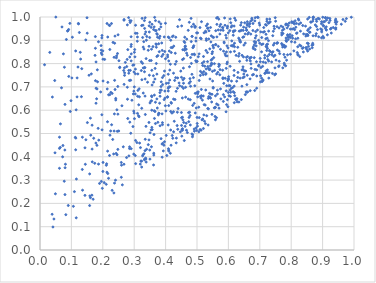
| Category | Series 0 |
|---|---|
| 0.498288084504814 | 0.808 |
| 0.7712849469028652 | 0.881 |
| 0.3610752900739218 | 0.748 |
| 0.5441978043446037 | 0.893 |
| 0.6381294547369215 | 0.941 |
| 0.3425508024026125 | 0.72 |
| 0.3225497973968985 | 0.808 |
| 0.3099196938789761 | 0.896 |
| 0.45659378610603785 | 0.694 |
| 0.39570439873722574 | 0.914 |
| 0.32880492180304 | 0.674 |
| 0.20595116301520655 | 0.818 |
| 0.81095965400833 | 0.946 |
| 0.6075335850087769 | 0.975 |
| 0.9012327985521255 | 0.916 |
| 0.35976170957734 | 0.873 |
| 0.6853803354135335 | 0.997 |
| 0.3721955241277032 | 0.648 |
| 0.8966328252999131 | 0.98 |
| 0.430854883248306 | 0.844 |
| 0.2388483591416437 | 0.918 |
| 0.3331992581761105 | 0.951 |
| 0.14613909639450762 | 0.473 |
| 0.41761358001471816 | 0.869 |
| 0.7201076829001994 | 0.874 |
| 0.18520662037668123 | 0.522 |
| 0.5363651818441578 | 0.779 |
| 0.48551435849503866 | 0.486 |
| 0.46215114475085506 | 0.531 |
| 0.9063372402394574 | 0.98 |
| 0.2325717729291269 | 0.891 |
| 0.43741979430480127 | 0.591 |
| 0.31026034572621064 | 0.914 |
| 0.27815317130274886 | 0.966 |
| 0.7974941636976385 | 0.84 |
| 0.2831915109259687 | 0.404 |
| 0.7210773274979005 | 0.965 |
| 0.2468655545136852 | 0.843 |
| 0.3795173052322397 | 0.947 |
| 0.3239614559268038 | 0.608 |
| 0.9420935814984361 | 0.953 |
| 0.8147538409132213 | 0.956 |
| 0.3559930770817392 | 0.6 |
| 0.22763540305755758 | 0.972 |
| 0.7287485697211986 | 0.738 |
| 0.43866834565489354 | 0.518 |
| 0.7236255096624674 | 0.761 |
| 0.17663968742522795 | 0.727 |
| 0.38245505392577006 | 0.66 |
| 0.04124424665349047 | 0.099 |
| 0.07456004113323711 | 0.842 |
| 0.47602573992512376 | 0.786 |
| 0.4082920911140294 | 0.694 |
| 0.4242015493657152 | 0.919 |
| 0.3286805898971016 | 0.871 |
| 0.6994864598893181 | 0.888 |
| 0.8522885137513432 | 0.942 |
| 0.9758285175503948 | 0.993 |
| 0.4085116118412945 | 0.682 |
| 0.07957796302730369 | 0.238 |
| 0.5006660288264231 | 0.543 |
| 0.47762123902518394 | 0.736 |
| 0.42552875003428203 | 0.507 |
| 0.668299143509246 | 0.822 |
| 0.6841773007975656 | 0.983 |
| 0.5825036543865815 | 0.736 |
| 0.3349641316234395 | 0.997 |
| 0.5042497808186104 | 0.83 |
| 0.4229118710659223 | 0.479 |
| 0.41510985411557155 | 0.415 |
| 0.5483470763309187 | 0.819 |
| 0.6357409841367977 | 0.81 |
| 0.35062802273521243 | 0.503 |
| 0.19765200377636016 | 0.516 |
| 0.0986890646494133 | 0.641 |
| 0.7561098997119684 | 0.858 |
| 0.7695216017111506 | 0.886 |
| 0.5984878593777454 | 0.615 |
| 0.6800299776858862 | 0.753 |
| 0.45955817644092267 | 0.47 |
| 0.4548197292854954 | 0.859 |
| 0.05044098092681515 | 1 |
| 0.518187981521036 | 0.792 |
| 0.7849769249960349 | 0.895 |
| 0.729210702332696 | 0.761 |
| 0.5585117038225375 | 0.613 |
| 0.45171621334515166 | 0.489 |
| 0.47207205778212114 | 0.943 |
| 0.27955056944318213 | 0.564 |
| 0.5224833196509326 | 0.932 |
| 0.5406630365154667 | 0.863 |
| 0.24865468607330055 | 0.924 |
| 0.6690007291884832 | 0.734 |
| 0.4162297562977876 | 0.515 |
| 0.779914038694462 | 0.87 |
| 0.7056210202139052 | 0.851 |
| 0.32371744228598887 | 0.963 |
| 0.7433659622518936 | 0.879 |
| 0.7202781776975793 | 0.769 |
| 0.6780736622117955 | 0.942 |
| 0.7802311977660062 | 0.827 |
| 0.3878334586954014 | 0.831 |
| 0.24328438534110086 | 0.825 |
| 0.7225122720794942 | 0.981 |
| 0.13302737083570193 | 0.778 |
| 0.5429395575782048 | 0.652 |
| 0.42105957859486953 | 0.491 |
| 0.2956075717531047 | 0.793 |
| 0.4786047510095939 | 0.645 |
| 0.5432074109342327 | 0.955 |
| 0.8874981987937459 | 0.915 |
| 0.18260616535259955 | 0.773 |
| 0.5492733344531588 | 0.767 |
| 0.7785238899427441 | 0.794 |
| 0.7281337149609888 | 0.939 |
| 0.1509297599306053 | 0.547 |
| 0.28279548332763416 | 0.759 |
| 0.4988391746978733 | 0.513 |
| 0.49451890608436455 | 0.588 |
| 0.25418166237050954 | 0.785 |
| 0.35673134010322705 | 0.969 |
| 0.2158705078853439 | 0.328 |
| 0.37218104514650063 | 0.83 |
| 0.7768264109129844 | 0.948 |
| 0.5019161735783679 | 0.675 |
| 0.6756181126712075 | 0.988 |
| 0.8622937213467708 | 0.979 |
| 0.7332886384549906 | 0.852 |
| 0.28225629251559947 | 0.997 |
| 0.3977825250915079 | 0.652 |
| 0.14320520638794565 | 0.235 |
| 0.1283659666055107 | 0.848 |
| 0.4964806658255433 | 0.91 |
| 0.362326959065403 | 0.415 |
| 0.3549116327669516 | 0.443 |
| 0.42524159241110493 | 0.759 |
| 0.3285133167330254 | 0.409 |
| 0.3348794980829891 | 0.734 |
| 0.11592743511386927 | 0.305 |
| 0.27571239498149225 | 0.397 |
| 0.5021435962120504 | 0.657 |
| 0.5633531298845149 | 0.968 |
| 0.24115430948604044 | 0.651 |
| 0.12946584281009643 | 0.819 |
| 0.20437670653262596 | 0.289 |
| 0.8118737215001133 | 0.892 |
| 0.41329762668817105 | 0.772 |
| 0.33752043244642305 | 0.531 |
| 0.940838471039762 | 0.986 |
| 0.4780066810066447 | 0.577 |
| 0.6981977159538705 | 0.974 |
| 0.10153909436565756 | 0.738 |
| 0.9596684138781851 | 0.969 |
| 0.3663013418588188 | 0.594 |
| 0.3823793900269784 | 0.533 |
| 0.38614978497345065 | 0.722 |
| 0.08228776399070792 | 0.152 |
| 0.6598369035594038 | 0.969 |
| 0.26784847586002203 | 0.711 |
| 0.45709249402579 | 0.716 |
| 0.46733472921499675 | 0.905 |
| 0.5331124402426568 | 0.847 |
| 0.08783969545608872 | 0.94 |
| 0.8213426147213776 | 0.839 |
| 0.3016507073813294 | 0.86 |
| 0.672488522953137 | 0.78 |
| 0.6055699517580457 | 0.788 |
| 0.9095295253694051 | 0.998 |
| 0.4606835697616267 | 0.858 |
| 0.43380412039221605 | 0.46 |
| 0.8186654631479718 | 0.932 |
| 0.6057935290594412 | 0.992 |
| 0.35611503511472964 | 0.771 |
| 0.45373162494569497 | 0.521 |
| 0.40222726840057565 | 0.715 |
| 0.47472556398617294 | 0.569 |
| 0.2122669585886019 | 0.37 |
| 0.5985929810880353 | 0.727 |
| 0.7871970567088021 | 0.953 |
| 0.2597495693892097 | 0.364 |
| 0.4843539741301408 | 0.917 |
| 0.8549556754584703 | 0.874 |
| 0.8798295007524534 | 0.989 |
| 0.44479861870490545 | 0.705 |
| 0.5142738680884456 | 0.98 |
| 0.701334396983236 | 0.822 |
| 0.5898186760891404 | 0.737 |
| 0.26647664891653333 | 0.77 |
| 0.0730902683971667 | 0.448 |
| 0.5013964771061916 | 0.532 |
| 0.2887675599553968 | 0.728 |
| 0.6277814071304525 | 0.636 |
| 0.39087799096542963 | 0.458 |
| 0.789081986445972 | 0.921 |
| 0.21532371011737284 | 0.424 |
| 0.6067223481639036 | 0.85 |
| 0.19852517608834697 | 0.265 |
| 0.7018219951856339 | 0.808 |
| 0.6045636570039268 | 0.942 |
| 0.390081958481749 | 0.538 |
| 0.7282406864094381 | 0.811 |
| 0.6518718524295916 | 0.975 |
| 0.35421730221219927 | 0.516 |
| 0.37808334567749025 | 0.587 |
| 0.33318719556526877 | 0.39 |
| 0.6684618227977539 | 0.825 |
| 0.28599986047685044 | 0.828 |
| 0.06203839501083974 | 0.351 |
| 0.21829624704125128 | 0.308 |
| 0.689459294206737 | 0.808 |
| 0.5972184394863578 | 0.96 |
| 0.2589614413732607 | 0.376 |
| 0.20011840408394255 | 0.854 |
| 0.6188107156557122 | 0.632 |
| 0.37050835834674944 | 0.87 |
| 0.3693098361054892 | 0.885 |
| 0.9648627753623499 | 0.989 |
| 0.2622665556253643 | 0.28 |
| 0.09119809290461756 | 0.946 |
| 0.336736216306571 | 0.936 |
| 0.6151925627552665 | 0.68 |
| 0.4959631411727241 | 0.812 |
| 0.34906314981500663 | 0.813 |
| 0.3381614916203163 | 0.377 |
| 0.20083963217286327 | 0.725 |
| 0.7246366296148117 | 0.831 |
| 0.1587434573365284 | 0.232 |
| 0.4886889550902084 | 0.74 |
| 0.22978111725638195 | 0.672 |
| 0.6838142208286839 | 0.685 |
| 0.3288971690828335 | 0.782 |
| 0.4523404932648387 | 0.517 |
| 0.29610694409111615 | 0.53 |
| 0.5625777590745485 | 0.755 |
| 0.6073210411332666 | 0.677 |
| 0.4811129746795235 | 0.994 |
| 0.4009063760739284 | 0.597 |
| 0.48635405389908337 | 0.621 |
| 0.5964895779233127 | 0.953 |
| 0.7147923566337894 | 0.937 |
| 0.29898085433219723 | 0.795 |
| 0.7201122099470906 | 0.763 |
| 0.49115240013417305 | 0.841 |
| 0.9006002533352426 | 0.999 |
| 0.7057355786668215 | 0.737 |
| 0.34759258236568946 | 0.962 |
| 0.42600874507988207 | 0.875 |
| 0.6924437148386021 | 0.944 |
| 0.18140724791696994 | 0.449 |
| 0.9431634666313673 | 0.969 |
| 0.5466958621836886 | 0.635 |
| 0.7972696421075256 | 0.912 |
| 0.9250579086475289 | 0.948 |
| 0.7721310972660977 | 0.943 |
| 0.6465041322640493 | 0.775 |
| 0.526143504724447 | 0.622 |
| 0.27759410211567537 | 0.818 |
| 0.09512869421324521 | 0.973 |
| 0.8975149850146898 | 0.945 |
| 0.7105698519232764 | 0.729 |
| 0.5207705930080044 | 0.831 |
| 0.5375906610893818 | 0.659 |
| 0.5109966294192732 | 0.909 |
| 0.515931093183327 | 0.558 |
| 0.8696743441298308 | 0.919 |
| 0.286102623289786 | 0.984 |
| 0.3809836987258274 | 0.63 |
| 0.23696890618381883 | 0.584 |
| 0.19313316121368296 | 0.678 |
| 0.33271508739313405 | 0.387 |
| 0.14321319293296852 | 0.439 |
| 0.3470431179153677 | 0.547 |
| 0.33276829337231584 | 0.765 |
| 0.2454965797046137 | 0.409 |
| 0.8546561881756182 | 0.886 |
| 0.5597131108521247 | 0.941 |
| 0.7465607945829769 | 0.95 |
| 0.8084967331737476 | 0.855 |
| 0.6855339739425295 | 0.91 |
| 0.8582485654385597 | 0.935 |
| 0.0685580818061966 | 0.696 |
| 0.859776084941875 | 0.935 |
| 0.2928258397355715 | 0.643 |
| 0.8963399737969632 | 0.971 |
| 0.5055564768893066 | 0.613 |
| 0.59650176764433 | 0.806 |
| 0.7945546715723792 | 0.914 |
| 0.30050549461953846 | 0.7 |
| 0.8395715910381324 | 0.927 |
| 0.46571814761744346 | 0.862 |
| 0.37063104802244407 | 0.882 |
| 0.3388362886794932 | 0.9 |
| 0.49708392484030917 | 0.524 |
| 0.8009253300954318 | 0.894 |
| 0.29004350142488255 | 0.984 |
| 0.4788650046352223 | 0.536 |
| 0.3573612891386746 | 0.517 |
| 0.7213496906010518 | 0.873 |
| 0.2220117918239295 | 0.963 |
| 0.6661092771380619 | 0.972 |
| 0.533602475846315 | 0.951 |
| 0.37799374627344384 | 0.885 |
| 0.4975744313439967 | 0.61 |
| 0.731535009382078 | 0.991 |
| 0.44440165225294714 | 0.988 |
| 0.3448934476908879 | 0.452 |
| 0.6793790844777017 | 0.865 |
| 0.7197901822067774 | 0.926 |
| 0.2376525149740779 | 0.728 |
| 0.504009202497611 | 0.679 |
| 0.42537453479192777 | 0.648 |
| 0.4181056109211154 | 0.848 |
| 0.41843429974957513 | 0.63 |
| 0.6431159383809422 | 0.703 |
| 0.31175796052313387 | 0.685 |
| 0.6725964913670722 | 0.827 |
| 0.6884720673710413 | 0.876 |
| 0.29034296962363537 | 0.812 |
| 0.5527884426701325 | 0.912 |
| 0.23731287194848505 | 0.287 |
| 0.16597388790655854 | 0.433 |
| 0.21086165465087825 | 0.282 |
| 0.8685266017597749 | 0.982 |
| 0.22980166057634654 | 0.256 |
| 0.6089846110853311 | 0.957 |
| 0.35536386603065195 | 0.661 |
| 0.07963623195541536 | 0.625 |
| 0.8631600082010481 | 0.978 |
| 0.5714146166165986 | 0.794 |
| 0.10632913463906934 | 0.187 |
| 0.9404522859194336 | 0.978 |
| 0.5407150142510185 | 0.775 |
| 0.5297176087210472 | 0.962 |
| 0.6158867742519853 | 0.879 |
| 0.7698908225839282 | 0.923 |
| 0.4668553311084167 | 0.845 |
| 0.21848961248603238 | 0.666 |
| 0.4609236740794689 | 0.913 |
| 0.30243535925650233 | 0.829 |
| 0.9270970802249155 | 0.952 |
| 0.6718942805622216 | 0.799 |
| 0.16533391039232814 | 0.235 |
| 0.5725270136493619 | 0.752 |
| 0.4610091272622432 | 0.89 |
| 0.0145186346162276 | 0.795 |
| 0.2762396028648676 | 0.787 |
| 0.34829791428266477 | 0.75 |
| 0.3033384595823564 | 0.67 |
| 0.18618716982256767 | 0.894 |
| 0.4737499020269682 | 0.551 |
| 0.6603933036310818 | 0.965 |
| 0.6768213337197478 | 0.751 |
| 0.6601367666457507 | 0.75 |
| 0.4845607991016798 | 0.917 |
| 0.3008348990344627 | 0.564 |
| 0.8807869373125985 | 0.959 |
| 0.8268216505572733 | 0.88 |
| 0.6782974064713614 | 0.972 |
| 0.4665122943583532 | 0.514 |
| 0.594275772061445 | 0.624 |
| 0.45743106483190543 | 0.821 |
| 0.5816691212986159 | 0.772 |
| 0.8243088168004076 | 0.987 |
| 0.33733262856948676 | 0.39 |
| 0.41746811515151716 | 0.45 |
| 0.2007935469016353 | 0.376 |
| 0.6699381239759586 | 0.811 |
| 0.5513575644348605 | 0.876 |
| 0.17866497537762216 | 0.694 |
| 0.4930569819254098 | 0.705 |
| 0.3953853700968457 | 0.645 |
| 0.6644341121515837 | 0.933 |
| 0.5019188552577498 | 0.932 |
| 0.3788286190720628 | 0.586 |
| 0.9231445897834204 | 0.994 |
| 0.6245847386299743 | 0.835 |
| 0.9122698132152366 | 0.987 |
| 0.5458466389929614 | 0.795 |
| 0.45511671751152194 | 0.731 |
| 0.18035101326052105 | 0.649 |
| 0.7274747607484466 | 0.974 |
| 0.6111680038069314 | 0.963 |
| 0.5309195800104526 | 0.576 |
| 0.5620966868377857 | 0.568 |
| 0.19693137793342985 | 0.91 |
| 0.4796024067945265 | 0.826 |
| 0.5649272293238853 | 0.669 |
| 0.18639617653531138 | 0.369 |
| 0.7385628105602237 | 0.837 |
| 0.4868017571062193 | 0.869 |
| 0.1872120331559397 | 0.472 |
| 0.6457938243486475 | 0.913 |
| 0.8475656642902336 | 0.925 |
| 0.4503370278761244 | 0.59 |
| 0.24492579282039217 | 0.602 |
| 0.2674852445975915 | 0.986 |
| 0.38477849167899214 | 0.971 |
| 0.6483345201432577 | 0.956 |
| 0.3947261253126302 | 0.449 |
| 0.5866118470633093 | 0.889 |
| 0.641164577372667 | 0.646 |
| 0.3472487137379031 | 0.874 |
| 0.45243664939737527 | 0.701 |
| 0.6709685492811389 | 0.982 |
| 0.529767363085258 | 0.9 |
| 0.8669725119645032 | 0.868 |
| 0.8387366176170493 | 0.85 |
| 0.410012578646606 | 0.429 |
| 0.656726782284231 | 0.679 |
| 0.7504933143222322 | 0.756 |
| 0.4755141977286983 | 0.977 |
| 0.290009403126938 | 0.873 |
| 0.5925713971721946 | 0.593 |
| 0.46198446307671504 | 0.873 |
| 0.8606393175529776 | 0.954 |
| 0.7090020949427277 | 0.788 |
| 0.29037039500669737 | 0.435 |
| 0.6089878184626603 | 0.694 |
| 0.5497993215400958 | 0.725 |
| 0.3447412931928183 | 0.857 |
| 0.7061754148836824 | 0.912 |
| 0.30347786086422146 | 0.405 |
| 0.7186554154929462 | 0.804 |
| 0.43840707416979297 | 0.738 |
| 0.3675589905161677 | 0.634 |
| 0.6303448130596514 | 0.762 |
| 0.3996159133636358 | 0.821 |
| 0.7490529252881809 | 0.997 |
| 0.37534517414391033 | 0.834 |
| 0.456696015512534 | 0.781 |
| 0.10966866379336271 | 0.25 |
| 0.47954616699255914 | 0.703 |
| 0.17643505118043235 | 0.866 |
| 0.838535620314669 | 0.868 |
| 0.09006980586097535 | 0.191 |
| 0.3343852630957359 | 0.927 |
| 0.35610929621388154 | 0.658 |
| 0.7452866815568397 | 0.96 |
| 0.6188522387440969 | 0.675 |
| 0.8367588596148626 | 0.963 |
| 0.5840498894357331 | 0.667 |
| 0.6588501418858914 | 0.677 |
| 0.5912821219292601 | 0.834 |
| 0.5105991671954908 | 0.66 |
| 0.6159470006124526 | 0.936 |
| 0.39928615649034904 | 0.619 |
| 0.6588145021556063 | 0.814 |
| 0.6606926916677659 | 0.83 |
| 0.42144797729155337 | 0.916 |
| 0.28602777131153356 | 0.549 |
| 0.7884360558984371 | 0.838 |
| 0.8532571972693688 | 0.92 |
| 0.7974002570405232 | 0.948 |
| 0.7020438856836676 | 0.722 |
| 0.07728620667931196 | 0.295 |
| 0.8692533579472277 | 0.881 |
| 0.07770860327867823 | 0.784 |
| 0.5478278322070388 | 0.668 |
| 0.7567276932718636 | 0.89 |
| 0.36301801058403194 | 0.496 |
| 0.6064840316282052 | 0.659 |
| 0.5199926400592985 | 0.752 |
| 0.8575369562184257 | 0.998 |
| 0.5938180645874857 | 0.85 |
| 0.7226411129824417 | 0.991 |
| 0.9033931228210846 | 0.911 |
| 0.9202222791014611 | 0.976 |
| 0.4505106244618152 | 0.741 |
| 0.4250593485590991 | 0.593 |
| 0.3554460598708352 | 0.641 |
| 0.741932571812735 | 0.851 |
| 0.23453200113472894 | 0.412 |
| 0.6996592478033015 | 0.965 |
| 0.4101265482984614 | 0.811 |
| 0.29066262545718813 | 0.842 |
| 0.0791801064245774 | 0.429 |
| 0.134780469580835 | 0.346 |
| 0.4344606779228116 | 0.48 |
| 0.5955907643248588 | 0.833 |
| 0.7107420088270319 | 0.935 |
| 0.35014826408717015 | 0.39 |
| 0.6131646788154923 | 0.697 |
| 0.5216446349584264 | 0.766 |
| 0.14582945029642158 | 0.902 |
| 0.8025980646888576 | 0.977 |
| 0.219860618450321 | 0.965 |
| 0.4636727814090478 | 0.698 |
| 0.6900682037662907 | 0.773 |
| 0.1763564740071082 | 0.916 |
| 0.8031395122851448 | 0.948 |
| 0.1970065708665999 | 0.58 |
| 0.5059708273479792 | 0.508 |
| 0.046857470941279566 | 0.727 |
| 0.2997494244007949 | 0.588 |
| 0.8140935589853897 | 0.906 |
| 0.32449217101062866 | 0.731 |
| 0.36781273844386764 | 0.984 |
| 0.804659522239519 | 0.909 |
| 0.28538867321429007 | 0.443 |
| 0.24792115264784198 | 0.432 |
| 0.8480206029172102 | 0.869 |
| 0.9116255911432062 | 0.958 |
| 0.7446396685201687 | 0.831 |
| 0.7904429748713737 | 0.963 |
| 0.4482950998337053 | 0.768 |
| 0.5816149246008016 | 0.955 |
| 0.6107742435263737 | 0.897 |
| 0.5453569928067814 | 0.919 |
| 0.846722661954022 | 0.918 |
| 0.5516782477625882 | 0.698 |
| 0.7503672484495958 | 0.982 |
| 0.34963550981672764 | 0.977 |
| 0.16351970637059687 | 0.756 |
| 0.5067941651379934 | 0.842 |
| 0.4937900052466532 | 0.955 |
| 0.9161456586430249 | 0.996 |
| 0.945503405204352 | 0.98 |
| 0.5131236548177752 | 0.514 |
| 0.3635747111371863 | 0.958 |
| 0.16646749011818873 | 0.378 |
| 0.4059999948204598 | 0.656 |
| 0.6601925754916143 | 0.98 |
| 0.049073677656258474 | 0.241 |
| 0.7192667898055441 | 0.907 |
| 0.5461943824962254 | 0.801 |
| 0.6579429253246333 | 0.943 |
| 0.6900513984258675 | 0.694 |
| 0.5343173803742033 | 0.607 |
| 0.36511388249204435 | 0.998 |
| 0.3503779591048696 | 0.631 |
| 0.7161511352889882 | 0.758 |
| 0.3720187260362273 | 0.929 |
| 0.5219104007518394 | 0.58 |
| 0.6412418936375593 | 0.976 |
| 0.6489311629895002 | 0.915 |
| 0.8661178843468217 | 0.879 |
| 0.5125969467892705 | 0.652 |
| 0.6463316056989111 | 0.739 |
| 0.5597811200061459 | 0.881 |
| 0.7548930724656319 | 0.959 |
| 0.6960352460917373 | 0.9 |
| 0.3266135148583642 | 0.801 |
| 0.330484049902111 | 0.894 |
| 0.26904416295221334 | 0.782 |
| 0.26741179159515094 | 0.368 |
| 0.789600265785698 | 0.914 |
| 0.7822593197021992 | 0.874 |
| 0.4084853985066287 | 0.754 |
| 0.31554395109961464 | 0.572 |
| 0.30376258884961105 | 0.756 |
| 0.3965280551388405 | 0.465 |
| 0.31935642094657524 | 0.369 |
| 0.6694436688396583 | 0.684 |
| 0.6344905638554614 | 0.939 |
| 0.53984474156351 | 0.672 |
| 0.1780663683559458 | 0.459 |
| 0.4887711305276209 | 0.969 |
| 0.6819842557638779 | 0.879 |
| 0.14440382512284022 | 0.368 |
| 0.3108599467159412 | 0.66 |
| 0.803219387230606 | 0.92 |
| 0.45380124837531766 | 0.817 |
| 0.18969808596132032 | 0.286 |
| 0.5578966134325101 | 0.611 |
| 0.41652419285532705 | 0.9 |
| 0.4320585166109021 | 0.74 |
| 0.7430645642880147 | 0.939 |
| 0.1709946482244965 | 0.48 |
| 0.11362743911054707 | 0.43 |
| 0.5821001740978848 | 0.954 |
| 0.5345072687512026 | 0.788 |
| 0.8227034860644432 | 0.991 |
| 0.6008365019241287 | 0.744 |
| 0.8684361202957187 | 0.887 |
| 0.2140892851723959 | 0.691 |
| 0.5440425678547188 | 0.669 |
| 0.3394661178381764 | 0.432 |
| 0.9914826686725914 | 0.999 |
| 0.522229120316192 | 0.808 |
| 0.4130142968184386 | 0.729 |
| 0.15615246396255023 | 0.75 |
| 0.24777586214461322 | 0.702 |
| 0.311718240411875 | 0.756 |
| 0.6822709216659655 | 0.894 |
| 0.3616828535681247 | 0.946 |
| 0.5469924896871567 | 0.8 |
| 0.6182028356946943 | 0.961 |
| 0.5364106601126134 | 0.606 |
| 0.4039668315614343 | 0.406 |
| 0.5754217827317926 | 0.968 |
| 0.5968105412344756 | 0.645 |
| 0.3492424823383893 | 0.912 |
| 0.42186863384205153 | 0.869 |
| 0.5954723951852486 | 0.876 |
| 0.7111633904152697 | 0.807 |
| 0.7483690001902091 | 0.782 |
| 0.2228690326463869 | 0.493 |
| 0.3338546560154023 | 0.783 |
| 0.3616876065052864 | 0.365 |
| 0.5352020639619464 | 0.953 |
| 0.22241380363584362 | 0.861 |
| 0.5827232457786855 | 0.739 |
| 0.16058832511974686 | 0.566 |
| 0.23779089762704264 | 0.887 |
| 0.24389811134097228 | 0.833 |
| 0.4099302376169064 | 0.62 |
| 0.03944676779772782 | 0.657 |
| 0.41000594236852705 | 0.425 |
| 0.411809895704802 | 0.854 |
| 0.7035440714692962 | 0.783 |
| 0.4114186600434513 | 0.91 |
| 0.625957942275287 | 0.645 |
| 0.45898966325021473 | 0.895 |
| 0.48392745005074833 | 0.498 |
| 0.4839101215974023 | 0.754 |
| 0.6270386827233217 | 0.65 |
| 0.3345022428690462 | 0.426 |
| 0.6613559175173084 | 0.926 |
| 0.30426868394460616 | 0.47 |
| 0.26781947162884445 | 0.989 |
| 0.7304470209479834 | 0.856 |
| 0.6969657705795451 | 0.793 |
| 0.1497446785710883 | 0.997 |
| 0.6226762874142622 | 0.647 |
| 0.1182482914024151 | 0.739 |
| 0.6433982801907231 | 0.836 |
| 0.7732979246100617 | 0.782 |
| 0.40632708778822035 | 0.658 |
| 0.5182275061959128 | 0.562 |
| 0.6537985021836614 | 0.888 |
| 0.451152740027824 | 0.962 |
| 0.3644748150286444 | 0.565 |
| 0.8810901795679065 | 0.981 |
| 0.6098249675516185 | 0.725 |
| 0.21600652867415449 | 0.72 |
| 0.5428101934227174 | 0.79 |
| 0.7767054291480319 | 0.839 |
| 0.854876413822426 | 0.947 |
| 0.8699393028535106 | 0.999 |
| 0.4693545860306587 | 0.504 |
| 0.19449812441932213 | 0.877 |
| 0.5499350164587086 | 0.914 |
| 0.331172958755815 | 0.862 |
| 0.702501866698294 | 0.748 |
| 0.3768301420237373 | 0.58 |
| 0.4096475650161243 | 0.699 |
| 0.3541515953220531 | 0.813 |
| 0.23597074599831858 | 0.511 |
| 0.39764327785676534 | 0.682 |
| 0.5588554661360357 | 0.662 |
| 0.36736881621158746 | 0.942 |
| 0.6194469975016 | 0.888 |
| 0.4821265141365114 | 0.801 |
| 0.5657271441144206 | 0.998 |
| 0.4288796349217001 | 0.728 |
| 0.43875512868955246 | 0.959 |
| 0.46373732580255633 | 0.656 |
| 0.715759590047997 | 0.824 |
| 0.48169530870320587 | 0.894 |
| 0.5891714299874673 | 0.964 |
| 0.6493788220405109 | 0.879 |
| 0.5575072496082865 | 0.573 |
| 0.337991610976184 | 0.821 |
| 0.5172095005455981 | 0.643 |
| 0.7125638557371134 | 0.955 |
| 0.21577940728790723 | 0.914 |
| 0.5019104161648726 | 0.67 |
| 0.47638029306680385 | 0.591 |
| 0.40646215203824276 | 0.837 |
| 0.851558614759919 | 0.923 |
| 0.8513109079844497 | 0.888 |
| 0.4398837178449383 | 0.607 |
| 0.5558722609972174 | 0.771 |
| 0.6683169526486018 | 0.971 |
| 0.3698946266929627 | 0.942 |
| 0.5335340342597787 | 0.808 |
| 0.7245667632647412 | 0.883 |
| 0.44717701524889075 | 0.507 |
| 0.5095111618461861 | 0.955 |
| 0.527879996652478 | 0.687 |
| 0.08096089055644073 | 0.368 |
| 0.8271166862917024 | 0.83 |
| 0.49106110207186926 | 0.519 |
| 0.49435469545821986 | 0.96 |
| 0.4089520406204181 | 0.717 |
| 0.5695417579225153 | 0.991 |
| 0.23906330361283656 | 0.689 |
| 0.2907738931261189 | 0.882 |
| 0.32807110372783965 | 0.965 |
| 0.5930647249762838 | 0.78 |
| 0.6369638053812392 | 0.898 |
| 0.24811627287431082 | 0.583 |
| 0.031125517795212998 | 0.848 |
| 0.808090142898587 | 0.95 |
| 0.7242377000796749 | 0.773 |
| 0.36428544648186467 | 0.665 |
| 0.6588454191626874 | 0.71 |
| 0.7549938383086906 | 0.889 |
| 0.5395247260220398 | 0.777 |
| 0.3855290113270202 | 0.478 |
| 0.5759818129962212 | 0.649 |
| 0.8069476779663622 | 0.974 |
| 0.26529915600294063 | 0.443 |
| 0.21352288528156882 | 0.972 |
| 0.6296308506691365 | 0.741 |
| 0.5625884485566255 | 0.627 |
| 0.5861735029068939 | 0.893 |
| 0.6191937976509377 | 0.852 |
| 0.7613005762457484 | 0.853 |
| 0.33119092872835154 | 0.413 |
| 0.8798326609615934 | 0.929 |
| 0.20046932525024908 | 0.819 |
| 0.7331649003053897 | 0.979 |
| 0.6342465150967554 | 0.843 |
| 0.389050906246477 | 0.398 |
| 0.6200840754252744 | 0.662 |
| 0.5880614861070043 | 0.657 |
| 0.3043957957723762 | 0.965 |
| 0.31579411593937 | 0.692 |
| 0.11799914501038578 | 0.657 |
| 0.9152688980016506 | 0.924 |
| 0.761252280965124 | 0.79 |
| 0.5748797994391274 | 0.691 |
| 0.4631405946481766 | 0.875 |
| 0.3801806403529423 | 0.909 |
| 0.646501227624831 | 0.786 |
| 0.6180378151572385 | 0.749 |
| 0.8857371124691588 | 0.994 |
| 0.38202279548840123 | 0.918 |
| 0.8068723892267881 | 0.978 |
| 0.5892344319215206 | 0.842 |
| 0.16923699369746947 | 0.218 |
| 0.25081328001221237 | 0.511 |
| 0.6510280202502103 | 0.768 |
| 0.43240576150949317 | 0.913 |
| 0.7073395914951005 | 0.723 |
| 0.5525251241065524 | 0.868 |
| 0.9238702826138321 | 0.985 |
| 0.36385509426970886 | 0.597 |
| 0.7219884756672029 | 0.881 |
| 0.9720793423328852 | 0.982 |
| 0.161721007558707 | 0.493 |
| 0.3238508524851178 | 0.356 |
| 0.3995734436441557 | 0.973 |
| 0.5001303754404719 | 0.569 |
| 0.3849828434210918 | 0.957 |
| 0.40854115009770997 | 0.914 |
| 0.23536702000502108 | 0.245 |
| 0.40823222155898875 | 0.537 |
| 0.33510722390741643 | 0.475 |
| 0.7763091573912962 | 0.878 |
| 0.3172153349381226 | 0.459 |
| 0.5069863503610916 | 0.728 |
| 0.759917366975694 | 0.787 |
| 0.36192468303471703 | 0.72 |
| 0.3250972644243 | 0.994 |
| 0.5531975393926719 | 0.826 |
| 0.7543895002658066 | 0.887 |
| 0.8246125673089519 | 0.969 |
| 0.7059085769037003 | 0.882 |
| 0.5106986552013627 | 0.749 |
| 0.31050252872289963 | 0.586 |
| 0.4828758829845279 | 0.958 |
| 0.6090932752635355 | 0.877 |
| 0.38869078464895024 | 0.455 |
| 0.6504480113619066 | 0.743 |
| 0.3226093586125125 | 0.77 |
| 0.5228969854518891 | 0.624 |
| 0.17849829765510306 | 0.807 |
| 0.5361881155432974 | 0.651 |
| 0.299321347162819 | 0.764 |
| 0.19746673763820521 | 0.921 |
| 0.36656786535777997 | 0.779 |
| 0.5015281836510882 | 0.677 |
| 0.5951998906920632 | 0.799 |
| 0.6490474452116887 | 0.755 |
| 0.6611440411139828 | 0.678 |
| 0.5285925828973613 | 0.856 |
| 0.5839259795927657 | 0.638 |
| 0.3038947629847901 | 0.776 |
| 0.5635167987647279 | 0.915 |
| 0.5449772560774778 | 0.815 |
| 0.22220331967085016 | 0.667 |
| 0.8019380342367711 | 0.98 |
| 0.16056995274768782 | 0.224 |
| 0.2590308403582938 | 0.312 |
| 0.9118953092065422 | 0.945 |
| 0.42027596973902137 | 0.588 |
| 0.3831433980168729 | 0.686 |
| 0.8294924322406587 | 0.939 |
| 0.5138593309523772 | 0.689 |
| 0.17439810720737203 | 0.372 |
| 0.6162241762237451 | 0.94 |
| 0.6053251201040118 | 0.686 |
| 0.7219204645235632 | 0.873 |
| 0.5354654637831214 | 0.536 |
| 0.5479032998690961 | 0.843 |
| 0.45090090928807414 | 0.568 |
| 0.18325497934935997 | 0.722 |
| 0.679329094585841 | 0.871 |
| 0.5551067951768794 | 0.61 |
| 0.3788553445193863 | 0.979 |
| 0.5693793170943185 | 0.788 |
| 0.2002409393716108 | 0.337 |
| 0.3086140511274543 | 0.461 |
| 0.5983738207068356 | 0.734 |
| 0.7613002839144579 | 0.953 |
| 0.33312731892463376 | 0.782 |
| 0.7413188255165069 | 0.92 |
| 0.5268462361312632 | 0.542 |
| 0.12221034938018172 | 0.972 |
| 0.5282791331998942 | 0.758 |
| 0.533341455861625 | 0.97 |
| 0.7254454564211563 | 0.817 |
| 0.591674891093291 | 0.922 |
| 0.5141519001732872 | 0.662 |
| 0.9087193128772532 | 0.953 |
| 0.165964043981775 | 0.536 |
| 0.78370087734955 | 0.899 |
| 0.4920846160128356 | 0.838 |
| 0.3092049310037519 | 0.93 |
| 0.5284422503729538 | 0.935 |
| 0.7676009974955601 | 0.961 |
| 0.7734099504397228 | 0.957 |
| 0.8125038077446841 | 0.984 |
| 0.636789752100246 | 0.895 |
| 0.49175494434920064 | 0.51 |
| 0.7697651391731529 | 0.932 |
| 0.8586978526909279 | 0.862 |
| 0.38991416331551865 | 0.74 |
| 0.3676131319205699 | 0.543 |
| 0.68836575366105 | 0.92 |
| 0.585305565511722 | 0.715 |
| 0.5747897227908472 | 0.861 |
| 0.478931727904205 | 0.723 |
| 0.4656037913408585 | 0.544 |
| 0.3899443352359371 | 0.547 |
| 0.6580162085203093 | 0.943 |
| 0.47307384655733653 | 0.59 |
| 0.8705641789728983 | 0.999 |
| 0.9021810802688336 | 0.964 |
| 0.24132008425018947 | 0.644 |
| 0.6563612766672746 | 0.953 |
| 0.3038177681603914 | 0.93 |
| 0.08400804635547976 | 0.904 |
| 0.15035840761183683 | 0.931 |
| 0.38535471380909825 | 0.702 |
| 0.5295796032792559 | 0.907 |
| 0.1816587307508436 | 0.691 |
| 0.12098089381199828 | 0.785 |
| 0.5198501202443017 | 0.661 |
| 0.3906343502768247 | 0.71 |
| 0.5390555210031026 | 0.774 |
| 0.63280438032048 | 0.909 |
| 0.13497078791543793 | 0.484 |
| 0.48842676699735044 | 0.871 |
| 0.35276571576519 | 0.639 |
| 0.4614961724473601 | 0.865 |
| 0.35385407258107304 | 0.956 |
| 0.4843065420815288 | 0.839 |
| 0.15802772375239793 | 0.191 |
| 0.782369519247342 | 0.791 |
| 0.396537980075648 | 0.768 |
| 0.3818398946300554 | 0.675 |
| 0.3927380554572323 | 0.425 |
| 0.06199468107132844 | 0.436 |
| 0.40200720510259247 | 0.492 |
| 0.21502411459987236 | 0.55 |
| 0.28460488394430516 | 0.728 |
| 0.6847690418419541 | 0.775 |
| 0.6851609738463474 | 0.86 |
| 0.7219737295597516 | 0.856 |
| 0.4174477832701664 | 0.633 |
| 0.5831589855040558 | 0.943 |
| 0.6538581407868594 | 0.667 |
| 0.3267242965448852 | 0.404 |
| 0.6182741402824592 | 0.771 |
| 0.32121542851652174 | 0.382 |
| 0.7235811245963568 | 0.909 |
| 0.27863537125541793 | 0.647 |
| 0.5414218527953745 | 0.655 |
| 0.45353313379263793 | 0.514 |
| 0.785356941918688 | 0.815 |
| 0.5947532362145249 | 0.705 |
| 0.7939046028559457 | 0.974 |
| 0.06468680471381782 | 0.44 |
| 0.3754337807968243 | 0.548 |
| 0.19538255358330214 | 0.294 |
| 0.9277602410051187 | 0.931 |
| 0.5097009349773904 | 0.517 |
| 0.5134127735304514 | 0.907 |
| 0.35516376991440635 | 0.862 |
| 0.9031262021973187 | 0.962 |
| 0.07203264549546495 | 0.4 |
| 0.7633094316129825 | 0.843 |
| 0.7030771868021739 | 0.936 |
| 0.8355646831135503 | 0.865 |
| 0.604906162308468 | 0.705 |
| 0.5587248778028112 | 0.559 |
| 0.7101656451944501 | 0.884 |
| 0.12533924934664942 | 0.933 |
| 0.5006590884607808 | 0.81 |
| 0.7376761761674336 | 0.807 |
| 0.06513751892370034 | 0.541 |
| 0.6925109021676285 | 0.999 |
| 0.7089706976327613 | 0.727 |
| 0.6154554936128003 | 0.922 |
| 0.43425477056553563 | 0.809 |
| 0.11535852550902181 | 0.138 |
| 0.1581860026024975 | 0.327 |
| 0.6572571330500675 | 0.827 |
| 0.6325504041927089 | 0.832 |
| 0.8780739345462251 | 0.92 |
| 0.3236605647262121 | 0.381 |
| 0.889587009235483 | 0.992 |
| 0.13554102593144957 | 0.257 |
| 0.3268861636789291 | 0.912 |
| 0.24605442951796874 | 0.509 |
| 0.6478984286804415 | 0.829 |
| 0.3144493222935575 | 0.623 |
| 0.42758133218825667 | 0.552 |
| 0.6422477491155761 | 0.943 |
| 0.2891417539937351 | 0.501 |
| 0.9419525576988494 | 0.948 |
| 0.45517577109280705 | 0.559 |
| 0.5493574825219663 | 0.851 |
| 0.5071756651392062 | 0.568 |
| 0.6534398319801508 | 0.927 |
| 0.047795040517194076 | 0.417 |
| 0.6334806960154583 | 0.635 |
| 0.5733450357022496 | 0.774 |
| 0.5844759917186302 | 0.854 |
| 0.5381667871898913 | 0.941 |
| 0.6210269407647367 | 0.941 |
| 0.38873186434287543 | 0.584 |
| 0.29854825978521715 | 0.412 |
| 0.849688086381586 | 0.861 |
| 0.8215388314664437 | 0.837 |
| 0.3742667622146796 | 0.913 |
| 0.11240365297741561 | 0.484 |
| 0.593628803885803 | 0.91 |
| 0.3919771941059733 | 0.839 |
| 0.783615727977644 | 0.91 |
| 0.7463445316645597 | 0.887 |
| 0.3345194733497241 | 0.66 |
| 0.6822765222170872 | 0.825 |
| 0.4151532912200675 | 0.797 |
| 0.5203636970295734 | 0.521 |
| 0.9116543221065928 | 0.945 |
| 0.30063074378229104 | 0.848 |
| 0.372245386025546 | 0.755 |
| 0.3733479862509408 | 0.925 |
| 0.13193355205860013 | 0.658 |
| 0.285224914169548 | 0.435 |
| 0.7180549426073797 | 0.967 |
| 0.6473054422399807 | 0.943 |
| 0.8168981392493861 | 0.93 |
| 0.7825638286378488 | 0.966 |
| 0.7288996770417211 | 0.974 |
| 0.34812720458582214 | 0.936 |
| 0.5624343797073535 | 0.996 |
| 0.4306358563256145 | 0.798 |
| 0.8836921055113575 | 0.946 |
| 0.527036165168461 | 0.939 |
| 0.47496191068495974 | 0.716 |
| 0.7762165036150372 | 0.879 |
| 0.4983641416018182 | 0.809 |
| 0.38914820746726075 | 0.857 |
| 0.19525916051903514 | 0.846 |
| 0.6550416408624484 | 0.768 |
| 0.7870106507516875 | 0.968 |
| 0.6854939893350965 | 0.887 |
| 0.6008180442900213 | 0.734 |
| 0.24044284210259825 | 0.3 |
| 0.6945484397038238 | 0.998 |
| 0.43679942496546775 | 0.534 |
| 0.5879093377722783 | 0.996 |
| 0.19743516996097943 | 0.839 |
| 0.3562013435232766 | 0.527 |
| 0.5110752954191875 | 0.767 |
| 0.49109492362313967 | 0.629 |
| 0.941408701084747 | 0.951 |
| 0.8312205246826043 | 0.875 |
| 0.433457677600667 | 0.681 |
| 0.2825388707729334 | 0.771 |
| 0.6183507624547391 | 0.703 |
| 0.8103399685702014 | 0.97 |
| 0.40644669770063646 | 0.829 |
| 0.599581897456998 | 0.932 |
| 0.9418521676548207 | 0.991 |
| 0.6434172781310319 | 0.773 |
| 0.751694810366028 | 0.815 |
| 0.7618499676114326 | 0.81 |
| 0.494464903217697 | 0.672 |
| 0.2781491303831244 | 0.699 |
| 0.7886054722025186 | 0.924 |
| 0.6389762374154099 | 0.965 |
| 0.45071775238424694 | 0.535 |
| 0.7727946024504423 | 0.871 |
| 0.5726230783262339 | 0.96 |
| 0.6355560967027262 | 0.903 |
| 0.3495306651459481 | 0.429 |
| 0.22810533237558406 | 0.538 |
| 0.4163564611329238 | 0.594 |
| 0.83018513116117 | 0.975 |
| 0.45767604893134617 | 0.547 |
| 0.45371485740457285 | 0.57 |
| 0.8208606610061192 | 0.872 |
| 0.34714016998097885 | 0.472 |
| 0.6019126514205465 | 0.662 |
| 0.6746023334228272 | 0.995 |
| 0.5728224937994268 | 0.927 |
| 0.41354354667028914 | 0.701 |
| 0.3045911816039776 | 0.371 |
| 0.8699875220125015 | 0.992 |
| 0.5412689703213347 | 0.734 |
| 0.695928768655512 | 0.79 |
| 0.175273364440791 | 0.835 |
| 0.29018015730620517 | 0.915 |
| 0.49651043412840423 | 0.897 |
| 0.11411815110623347 | 0.48 |
| 0.796106268165315 | 0.925 |
| 0.7393516399501155 | 0.847 |
| 0.5676409398520149 | 0.945 |
| 0.3704904224912057 | 0.801 |
| 0.38652263896515515 | 0.686 |
| 0.6019616372744154 | 0.705 |
| 0.2876072187476243 | 0.771 |
| 0.4863317464275835 | 0.494 |
| 0.8472721617728907 | 0.868 |
| 0.5166778120337492 | 0.802 |
| 0.442927640952376 | 0.717 |
| 0.07995473507922635 | 0.353 |
| 0.5673576776088134 | 0.622 |
| 0.7302604892011817 | 0.839 |
| 0.5663825612430005 | 0.763 |
| 0.3660781258061955 | 0.734 |
| 0.07003929950634635 | 0.957 |
| 0.5756168417788419 | 0.944 |
| 0.04440289536304043 | 0.133 |
| 0.3570050887409839 | 0.708 |
| 0.19504962048717 | 0.858 |
| 0.5247342547964471 | 0.789 |
| 0.23158087246087766 | 0.475 |
| 0.5158618278112063 | 0.76 |
| 0.4533699515058337 | 0.652 |
| 0.21314257364545275 | 0.334 |
| 0.1136147789826708 | 0.854 |
| 0.7482577220088727 | 0.836 |
| 0.8969779051371201 | 0.936 |
| 0.8519633150412911 | 0.925 |
| 0.637431614337556 | 0.738 |
| 0.671317844920736 | 0.927 |
| 0.03864837773952623 | 0.153 |
| 0.6903053128710532 | 0.747 |
| 0.26947444100917317 | 0.76 |
| 0.4723445058043191 | 0.648 |
| 0.29895015767760835 | 0.682 |
| 0.7836300588971692 | 0.97 |
| 0.12272814299482326 | 0.97 |
| 0.5695769676539283 | 0.798 |
| 0.4090272041714218 | 0.435 |
| 0.4298681281768294 | 0.646 |
| 0.33249012407006384 | 0.985 |
| 0.11517127661651849 | 0.602 |
| 0.8524084915319337 | 0.854 |
| 0.2513991691444868 | 0.812 |
| 0.062109205852863836 | 0.484 |
| 0.7779219103387658 | 0.802 |
| 0.379860668596238 | 0.851 |
| 0.29718945245112405 | 0.67 |
| 0.22552601537676975 | 0.677 |
| 0.6194505516501334 | 0.873 |
| 0.8165741471679667 | 0.973 |
| 0.7902727514615603 | 0.904 |
| 0.22499123718480052 | 0.511 |
| 0.6199043891464504 | 0.995 |
| 0.4378243685193577 | 0.694 |
| 0.5998633120318794 | 0.676 |
| 0.8939926279461107 | 0.949 |
| 0.3971784953504627 | 0.852 |
| 0.3943491296985072 | 0.749 |
| 0.31379043434689646 | 0.576 |
| 0.23592142024150187 | 0.827 |
| 0.87002502767362 | 0.999 |
| 0.45883665588608535 | 0.736 |
| 0.4987486789103067 | 0.932 |
| 0.46902552822336885 | 0.836 |
| 0.26093350167891716 | 0.619 |
| 0.29854805335019485 | 0.596 |
| 0.5987089693208251 | 0.867 |
| 0.387679400329383 | 0.889 |
| 0.6385963466214142 | 0.892 |
| 0.5291090509748492 | 0.777 |
| 0.26925587461100986 | 0.75 |
| 0.3200212506177714 | 0.439 |
| 0.6870894034651335 | 0.893 |
| 0.27174672839992076 | 0.805 |
| 0.6868380487714184 | 0.937 |
| 0.2871208879027479 | 0.976 |
| 0.5590417978108262 | 0.882 |
| 0.6230283662943014 | 0.986 |
| 0.34016517209328134 | 0.916 |
| 0.8966928836951068 | 0.911 |
| 0.7169507818792872 | 0.759 |
| 0.6263654931658098 | 0.724 |
| 0.5678375372921614 | 0.874 |
| 0.7157874996503877 | 0.836 |
| 0.10314618378148299 | 0.913 |
| 0.8523253843365767 | 0.991 |
| 0.24251168626398056 | 0.415 |
| 0.33652202940933607 | 0.394 |
| 0.5375146131785982 | 0.906 |
| 0.22146688007985238 | 0.406 |
| 0.8767843058124437 | 0.966 |
| 0.5702427539713869 | 0.609 |
| 0.8193237139940243 | 0.847 |
| 0.09647583801486725 | 0.595 |
| 0.7242996883686805 | 0.866 |
| 0.7738996730850377 | 0.929 |
| 0.7401303232088882 | 0.758 |
| 0.489771813969493 | 0.877 |
| 0.9027039957691623 | 0.979 |
| 0.5237547997001561 | 0.553 |
| 0.3624939664079444 | 0.407 |
| 0.33546273620970435 | 0.582 |
| 0.5554457969641006 | 0.8 |
| 0.2112378642732322 | 0.364 |
| 0.6668744786823201 | 0.959 |
| 0.8456200831125683 | 0.961 |
| 0.9339751642931022 | 0.955 |
| 0.5476453707996488 | 0.582 |
| 0.9085818041968454 | 0.997 |
| 0.592942727939198 | 0.683 |
| 0.8211946475585922 | 0.909 |
| 0.4932404214992828 | 0.958 |
| 0.25367095129893114 | 0.783 |
| 0.2796238677171571 | 0.86 |
| 0.31659956906231135 | 0.657 |
| 0.629863788879737 | 0.87 |
| 0.08852945457605377 | 0.941 |
| 0.5650397081575265 | 0.686 |
| 0.72766301331556 | 0.898 |
| 0.1784023300137061 | 0.63 |
| 0.5515153192704776 | 0.695 |
| 0.5278195571195696 | 0.754 |
| 0.09168094538208382 | 0.745 |
| 0.5506972414752838 | 0.878 |
| 0.6139047667250733 | 0.875 |
| 0.3736531379943696 | 0.609 |
| 0.7474420265693643 | 0.752 |